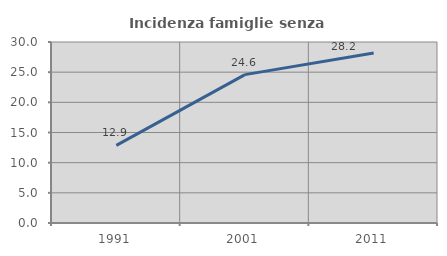
| Category | Incidenza famiglie senza nuclei |
|---|---|
| 1991.0 | 12.859 |
| 2001.0 | 24.595 |
| 2011.0 | 28.165 |